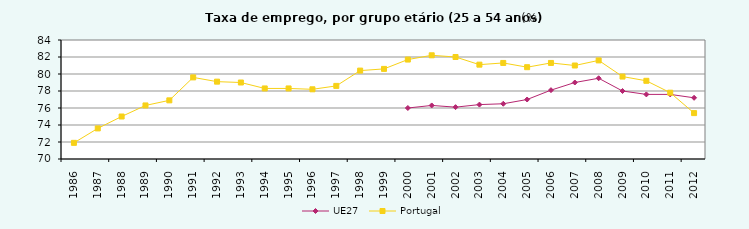
| Category | UE27 | Portugal |
|---|---|---|
| 1986 | 0 | 71.9 |
| 1987 | 0 | 73.6 |
| 1988 | 0 | 75 |
| 1989 | 0 | 76.3 |
| 1990 | 0 | 76.9 |
| 1991 | 0 | 79.6 |
| 1992 | 0 | 79.1 |
| 1993 | 0 | 79 |
| 1994 | 0 | 78.3 |
| 1995 | 0 | 78.3 |
| 1996 | 0 | 78.2 |
| 1997 | 0 | 78.6 |
| 1998 | 0 | 80.4 |
| 1999 | 0 | 80.6 |
| 2000 | 76 | 81.7 |
| 2001 | 76.3 | 82.2 |
| 2002 | 76.1 | 82 |
| 2003 | 76.4 | 81.1 |
| 2004 | 76.5 | 81.3 |
| 2005 | 77 | 80.8 |
| 2006 | 78.1 | 81.3 |
| 2007 | 79 | 81 |
| 2008 | 79.5 | 81.6 |
| 2009 | 78 | 79.7 |
| 2010 | 77.6 | 79.2 |
| 2011 | 77.6 | 77.8 |
| 2012 | 77.2 | 75.4 |